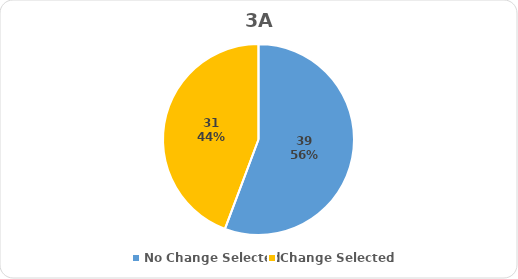
| Category | Series 0 |
|---|---|
| No Change Selected | 39 |
| Change Selected | 31 |